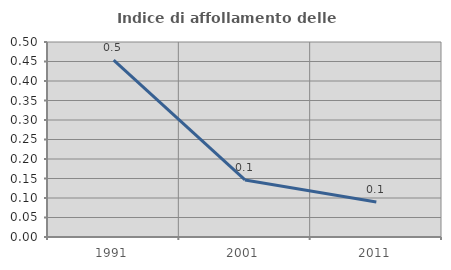
| Category | Indice di affollamento delle abitazioni  |
|---|---|
| 1991.0 | 0.453 |
| 2001.0 | 0.146 |
| 2011.0 | 0.09 |